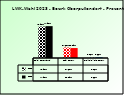
| Category | 2018 | 2023 |
|---|---|---|
| Bgld. Bauernbund | 0.74 | 0.749 |
| SPÖ Bauern | 0.247 | 0.234 |
| Freiheitliche Bauern | 0.014 | 0.017 |